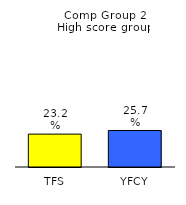
| Category | Series 0 |
|---|---|
| TFS | 0.232 |
| YFCY | 0.257 |